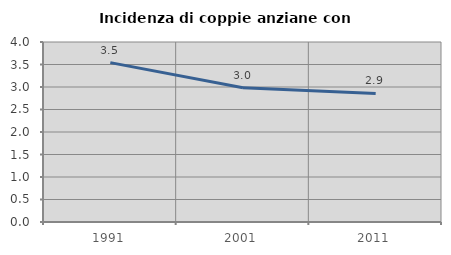
| Category | Incidenza di coppie anziane con figli |
|---|---|
| 1991.0 | 3.542 |
| 2001.0 | 2.982 |
| 2011.0 | 2.857 |